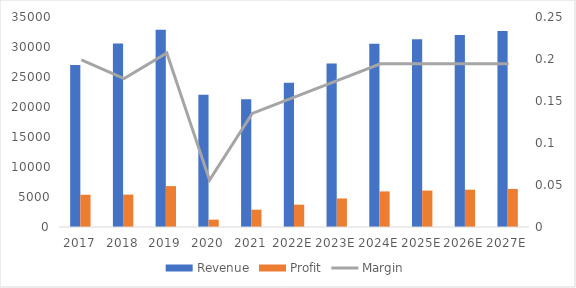
| Category | Revenue | Profit |
|---|---|---|
| 2017 | 27014 | 5375.786 |
| 2018 | 30567 | 5400 |
| 2019 | 32876 | 6812 |
| 2020 | 22042 | 1229 |
| 2021 | 21310 | 2882 |
| 2022E | 24037.61 | 3723.997 |
| 2023E | 27232.214 | 4754.905 |
| 2024E | 30534.264 | 5932.44 |
| 2025E | 31275.33 | 6076.421 |
| 2026E | 31995.437 | 6216.329 |
| 2027E | 32653.722 | 6344.225 |